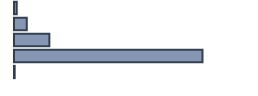
| Category | Percentatge |
|---|---|
| 0 | 1.159 |
| 1 | 5.289 |
| 2 | 14.732 |
| 3 | 78.537 |
| 4 | 0.283 |